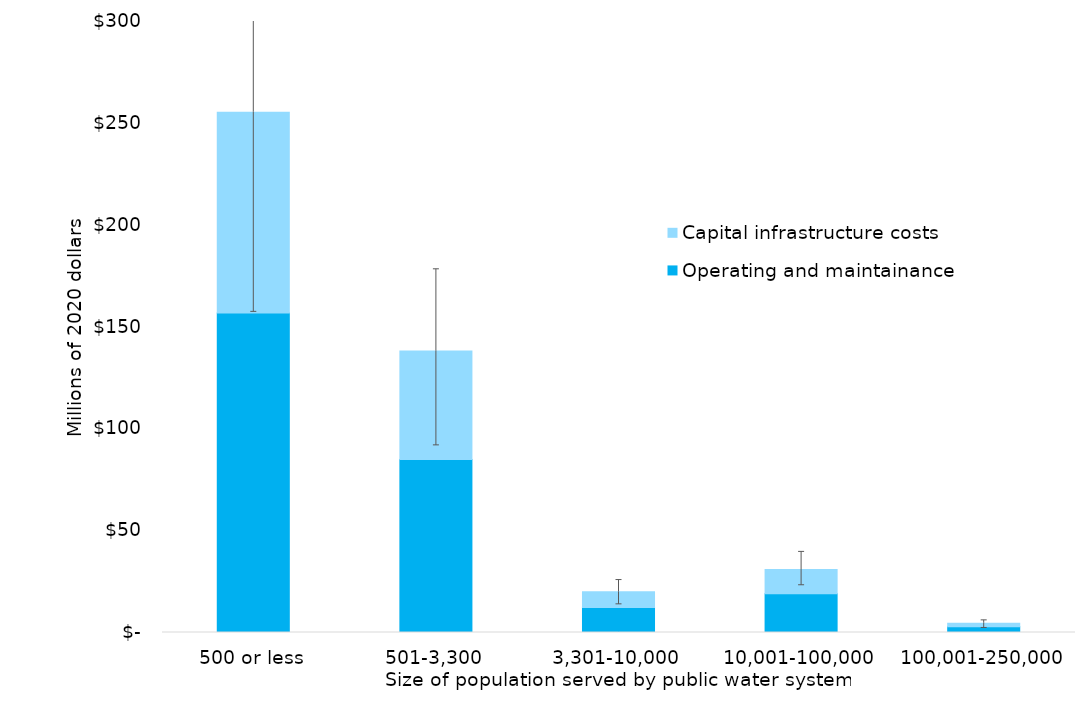
| Category | Operating and maintainance cost | Capital infrastructure costs |
|---|---|---|
| 500 or less | 156.893 | 98.567 |
| 501-3,300 | 84.905 | 53.279 |
| 3,301-10,000 | 12.292 | 7.708 |
| 10,001-100,000 | 19.007 | 11.903 |
| 100,001-250,000 | 2.788 | 1.757 |